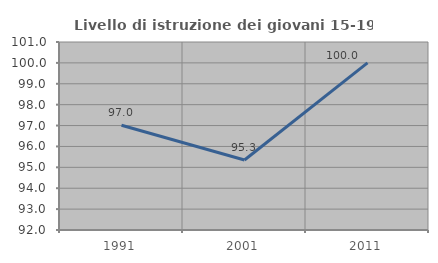
| Category | Livello di istruzione dei giovani 15-19 anni |
|---|---|
| 1991.0 | 97.015 |
| 2001.0 | 95.349 |
| 2011.0 | 100 |